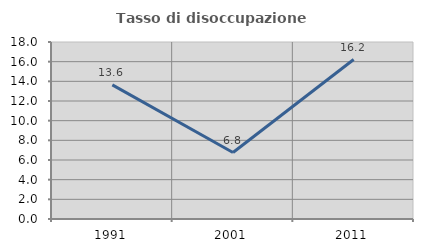
| Category | Tasso di disoccupazione giovanile  |
|---|---|
| 1991.0 | 13.636 |
| 2001.0 | 6.757 |
| 2011.0 | 16.216 |